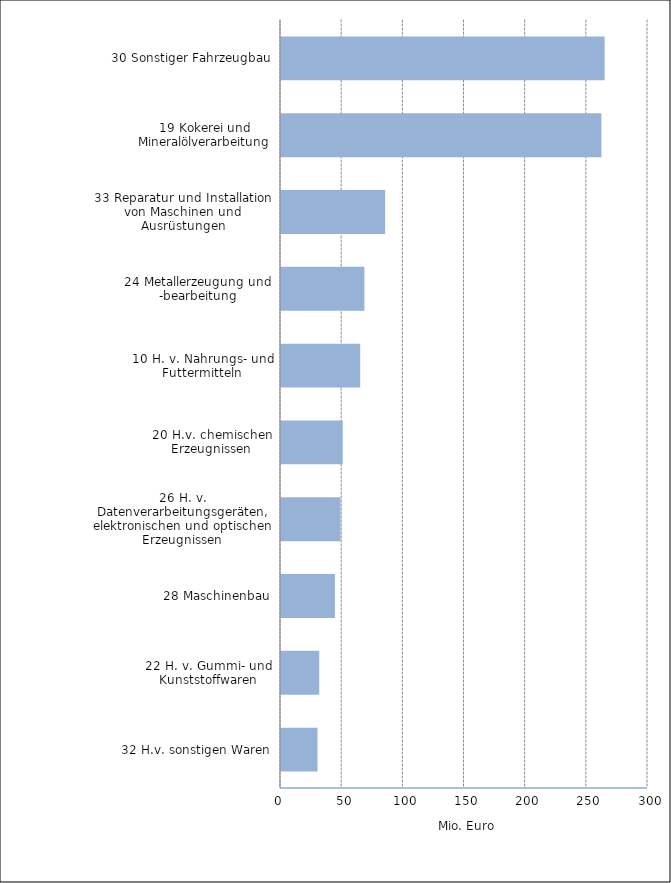
| Category | Mio. Euro |
|---|---|
| 32 H.v. sonstigen Waren | 29.852 |
| 22 H. v. Gummi- und Kunststoffwaren | 31.248 |
| 28 Maschinenbau | 44.068 |
| 26 H. v. Datenverarbeitungsgeräten, elektronischen und optischen Erzeugnissen | 48.696 |
| 20 H.v. chemischen Erzeugnissen | 50.476 |
| 10 H. v. Nahrungs- und Futtermitteln | 64.742 |
| 24 Metallerzeugung und -bearbeitung | 68.188 |
| 33 Reparatur und Installation von Maschinen und Ausrüstungen | 85.128 |
| 19 Kokerei und Mineralölverarbeitung | 261.903 |
| 30 Sonstiger Fahrzeugbau | 264.549 |